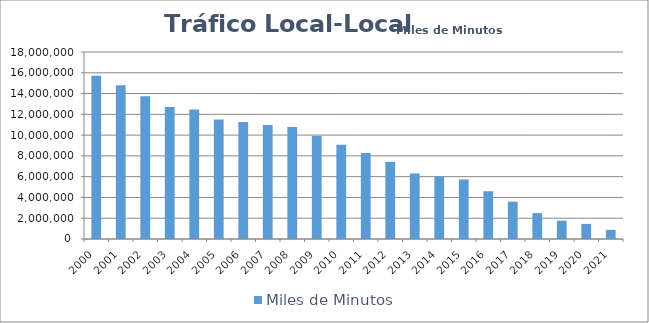
| Category | Miles de Minutos |
|---|---|
| 2000 | 15708021.692 |
| 2001 | 14792112.011 |
| 2002 | 13741512.578 |
| 2003 | 12697840.356 |
| 2004 | 12471681.103 |
| 2005 | 11497364.137 |
| 2006 | 11250082.402 |
| 2007 | 10981107.318 |
| 2008 | 10792163.023 |
| 2009 | 9925576.314 |
| 2010 | 9070767.124 |
| 2011 | 8283065.602 |
| 2012 | 7428037.584 |
| 2013 | 6310456.472 |
| 2014 | 6026527.532 |
| 2015 | 5731826.348 |
| 2016 | 4599625.362 |
| 2017 | 3595888.694 |
| 2018 | 2491247.166 |
| 2019 | 1765464.035 |
| 2020 | 1457202.189 |
| 2021 | 876408.047 |